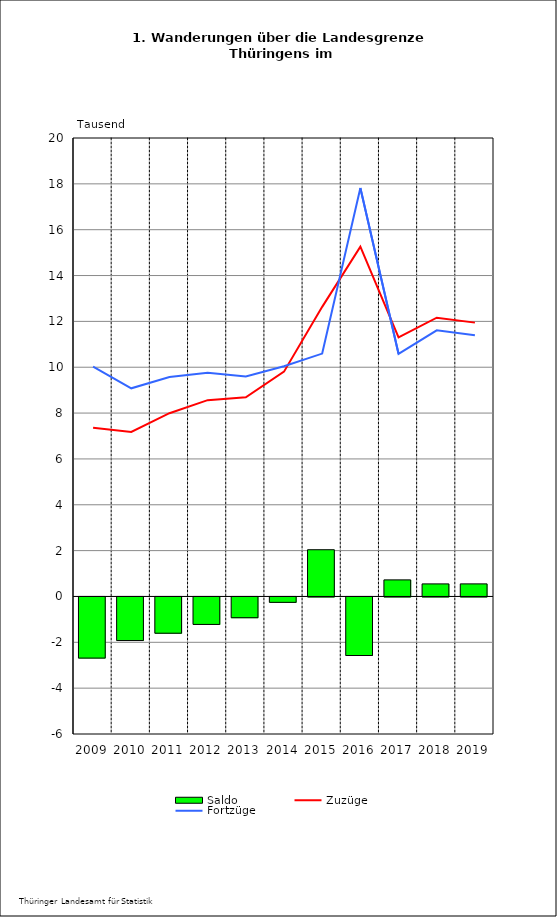
| Category | Saldo |
|---|---|
| 2009.0 | -2.667 |
| 2010.0 | -1.902 |
| 2011.0 | -1.582 |
| 2012.0 | -1.198 |
| 2013.0 | -0.906 |
| 2014.0 | -0.235 |
| 2015.0 | 2.039 |
| 2016.0 | -2.554 |
| 2017.0 | 0.723 |
| 2018.0 | 0.548 |
| 2019.0 | 0.549 |